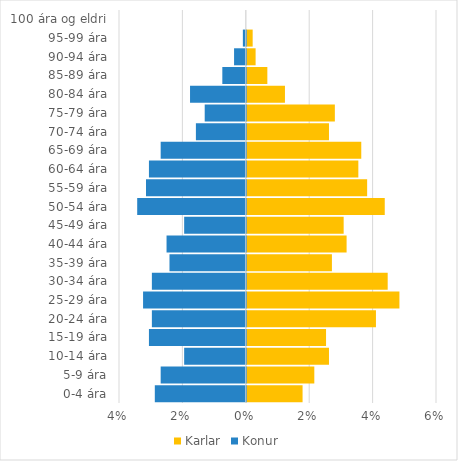
| Category | Karlar | Konur |
|---|---|---|
| 0-4 ára | 0.018 | -0.029 |
| 5-9 ára | 0.021 | -0.027 |
| 10-14 ára | 0.026 | -0.019 |
| 15-19 ára | 0.025 | -0.031 |
| 20-24 ára | 0.041 | -0.03 |
| 25-29 ára | 0.048 | -0.032 |
| 30-34 ára | 0.044 | -0.03 |
| 35-39 ára | 0.027 | -0.024 |
| 40-44 ára | 0.031 | -0.025 |
| 45-49 ára | 0.031 | -0.019 |
| 50-54 ára | 0.044 | -0.034 |
| 55-59 ára | 0.038 | -0.031 |
| 60-64 ára | 0.035 | -0.031 |
| 65-69 ára | 0.036 | -0.027 |
| 70-74 ára | 0.026 | -0.016 |
| 75-79 ára | 0.028 | -0.013 |
| 80-84 ára | 0.012 | -0.018 |
| 85-89 ára | 0.006 | -0.007 |
| 90-94 ára | 0.003 | -0.004 |
| 95-99 ára | 0.002 | -0.001 |
| 100 ára og eldri | 0 | 0 |